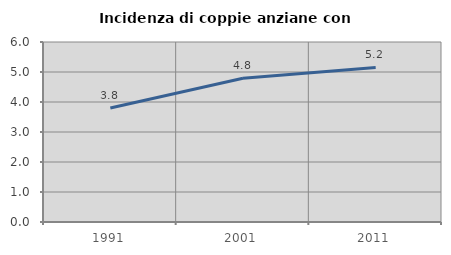
| Category | Incidenza di coppie anziane con figli |
|---|---|
| 1991.0 | 3.8 |
| 2001.0 | 4.794 |
| 2011.0 | 5.153 |